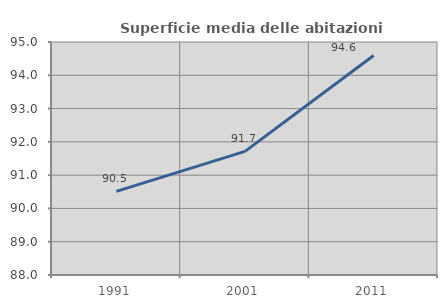
| Category | Superficie media delle abitazioni occupate |
|---|---|
| 1991.0 | 90.511 |
| 2001.0 | 91.715 |
| 2011.0 | 94.596 |